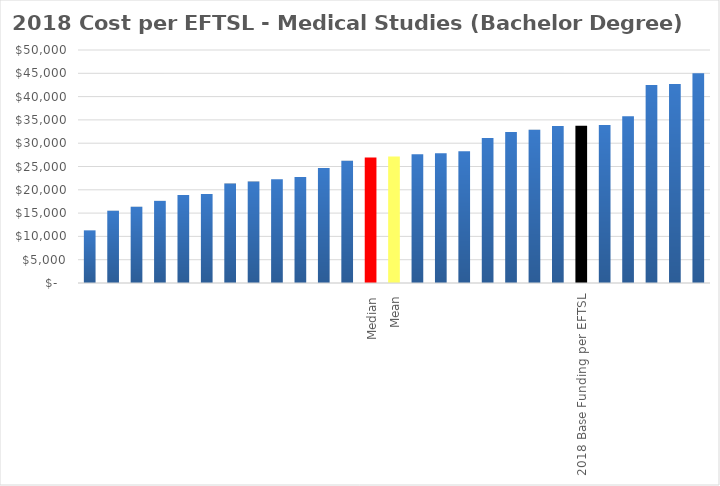
| Category | Series 0 |
|---|---|
|  | 11298.655 |
|  | 15509.808 |
|  | 16383.783 |
|  | 17627.646 |
|  | 18886.901 |
|  | 19089.813 |
|  | 21345.386 |
|  | 21762.675 |
|  | 22277.564 |
|  | 22730.374 |
|  | 24659.954 |
|  | 26251.458 |
| Median | 26936.829 |
| Mean | 27148.507 |
|  | 27622.2 |
|  | 27858.227 |
|  | 28279.967 |
|  | 31099.922 |
|  | 32420.716 |
|  | 32889.555 |
|  | 33685.858 |
| 2018 Base Funding per EFTSL | 33724.695 |